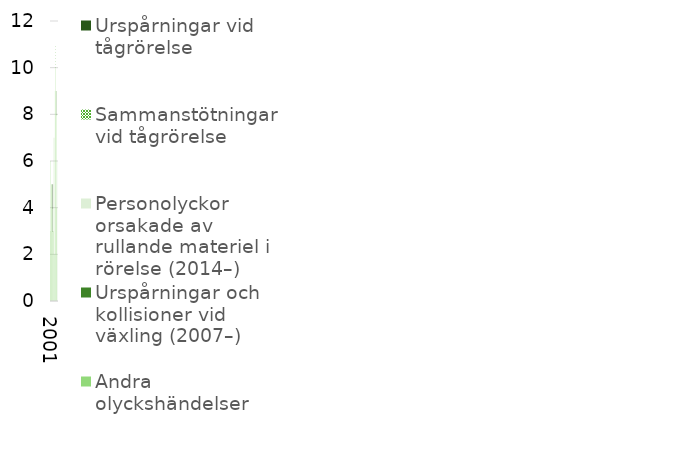
| Category | Andra olyckshändelser | Urspårningar och kollisioner vid växling (2007–) | Personolyckor orsakade av rullande materiel i rörelse (2014–) | Sammanstötningar vid tågrörelse | Urspårningar vid tågrörelse |
|---|---|---|---|---|---|
| 2001.0 | 3 | 0 | 0 | 0 | 0 |
| 2002.0 | 6 | 0 | 0 | 0 | 0 |
| 2003.0 | 5 | 0 | 0 | 0 | 0 |
| 2004.0 | 5 | 0 | 0 | 0 | 0 |
| 2005.0 | 3 | 0 | 0 | 0 | 2 |
| 2006.0 | 4 | 0 | 0 | 0 | 1 |
| 2007.0 | 3 | 0 | 0 | 0 | 0 |
| 2008.0 | 7 | 0 | 0 | 0 | 0 |
| 2009.0 | 2 | 0 | 0 | 0 | 0 |
| 2010.0 | 9 | 0 | 0 | 0 | 0 |
| 2011.0 | 10 | 0 | 0 | 1 | 0 |
| 2012.0 | 8 | 1 | 0 | 0 | 0 |
| 2013.0 | 4 | 0 | 0 | 0 | 0 |
| 2014.0 | 0 | 0 | 2 | 0 | 0 |
| 2015.0 | 0 | 0 | 6 | 0 | 0 |